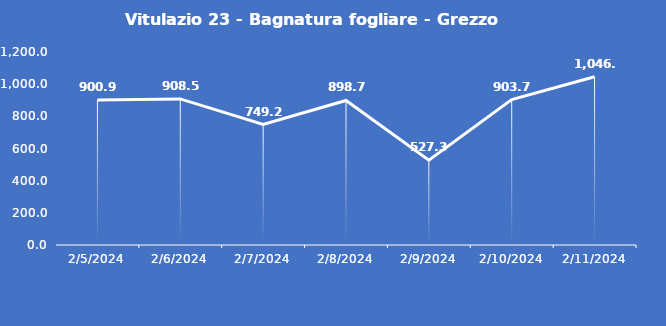
| Category | Vitulazio 23 - Bagnatura fogliare - Grezzo (min) |
|---|---|
| 2/5/24 | 900.9 |
| 2/6/24 | 908.5 |
| 2/7/24 | 749.2 |
| 2/8/24 | 898.7 |
| 2/9/24 | 527.3 |
| 2/10/24 | 903.7 |
| 2/11/24 | 1046.4 |